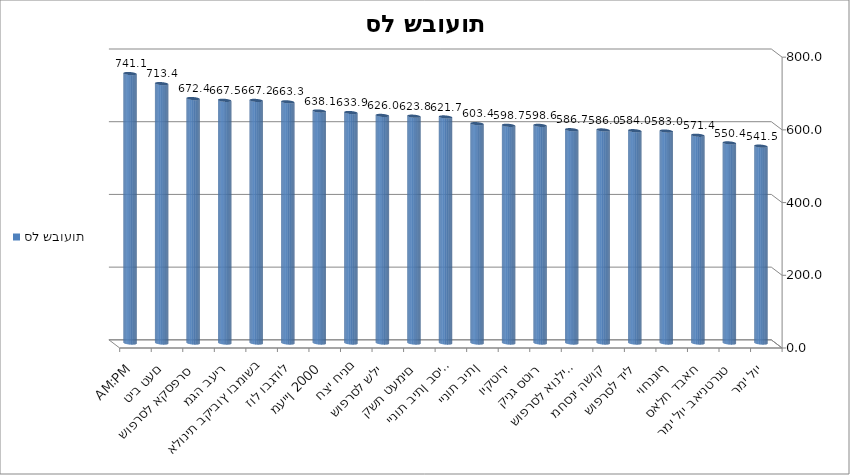
| Category | סל שבועות |
|---|---|
| רמי לוי | 541.51 |
| רמי לוי באינטרנט | 550.4 |
| סאלח דבאח | 571.37 |
| יוחננוף | 582.96 |
| שופרסל דיל | 583.98 |
| מחסני השוק | 585.99 |
| שופרסל אונליין | 586.71 |
| קינג סטור | 598.59 |
| ויקטורי | 598.73 |
| יינות ביתן | 603.37 |
| יינות ביתן בסיטי | 621.74 |
| קשת טעמים | 623.82 |
| שופרסל שלי | 625.97 |
| חצי חינם | 633.89 |
| מעיין 2000 | 638.1 |
| זול ובגדול | 663.31 |
| אלונית בקיבוץ ובמושב | 667.23 |
| מגה בעיר | 667.54 |
| שופרסל אקספרס | 672.4 |
| טיב טעם | 713.43 |
| AM:PM | 741.14 |